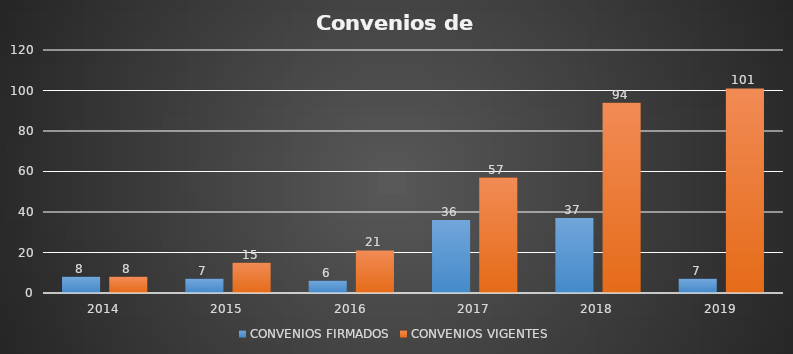
| Category | CONVENIOS FIRMADOS | CONVENIOS VIGENTES |
|---|---|---|
| 2014.0 | 8 | 8 |
| 2015.0 | 7 | 15 |
| 2016.0 | 6 | 21 |
| 2017.0 | 36 | 57 |
| 2018.0 | 37 | 94 |
| 2019.0 | 7 | 101 |